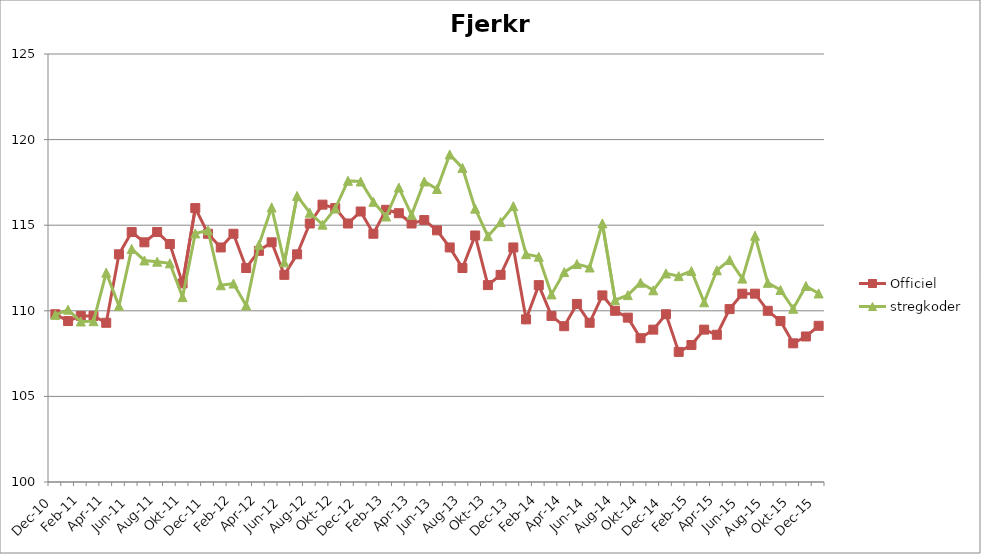
| Category | Officiel | stregkoder |
|---|---|---|
|  Dec-10 | 109.8 | 109.766 |
|  Jan-11 | 109.4 | 110.069 |
|  Feb-11 | 109.7 | 109.375 |
|  Mar-11 | 109.7 | 109.392 |
|  Apr-11 | 109.3 | 112.228 |
|  Maj-11 | 113.3 | 110.278 |
|  Jun-11 | 114.6 | 113.613 |
|  Jul-11 | 114 | 112.941 |
|  Aug-11 | 114.6 | 112.869 |
|  Sep-11 | 113.9 | 112.773 |
|  Okt-11 | 111.6 | 110.8 |
|  Nov-11 | 116 | 114.517 |
|  Dec-11 | 114.5 | 114.702 |
|  Jan-12 | 113.7 | 111.493 |
|  Feb-12 | 114.5 | 111.592 |
|  Mar-12 | 112.5 | 110.309 |
|  Apr-12 | 113.5 | 113.854 |
|  Maj-12 | 114 | 116.037 |
|  Jun-12 | 112.1 | 112.829 |
|  Jul-12 | 113.3 | 116.711 |
|  Aug-12 | 115.1 | 115.728 |
|  Sep-12 | 116.2 | 115.032 |
|  Okt-12 | 116 | 115.973 |
|  Nov-12 | 115.1 | 117.595 |
|  Dec-12 | 115.8 | 117.551 |
|  Jan-13 | 114.5 | 116.366 |
|  Feb-13 | 115.9 | 115.507 |
|  Mar-13 | 115.7 | 117.201 |
|  Apr-13 | 115.1 | 115.603 |
|  Maj-13 | 115.3 | 117.554 |
|  Jun-13 | 114.7 | 117.115 |
|  Jul-13 | 113.7 | 119.133 |
|  Aug-13 | 112.5 | 118.348 |
|  Sep-13 | 114.4 | 115.968 |
|  Okt-13 | 111.5 | 114.358 |
|  Nov-13 | 112.1 | 115.181 |
|  Dec-13 | 113.7 | 116.113 |
|  Jan-14 | 109.5 | 113.308 |
|  Feb-14 | 111.5 | 113.16 |
|  Mar-14 | 109.7 | 110.958 |
|  Apr-14 | 109.1 | 112.259 |
|  Maj-14 | 110.4 | 112.731 |
|  Jun-14 | 109.3 | 112.529 |
|  Jul-14 | 110.9 | 115.104 |
|  Aug-14 | 110 | 110.618 |
|  Sep-14 | 109.6 | 110.916 |
|  Okt-14 | 108.4 | 111.642 |
|  Nov-14 | 108.9 | 111.198 |
|  Dec-14 | 109.8 | 112.185 |
|  Jan-15 | 107.6 | 112.027 |
|  Feb-15 | 108 | 112.322 |
|  Mar-15 | 108.9 | 110.497 |
|  Apr-15 | 108.6 | 112.365 |
|  Maj-15 | 110.1 | 112.966 |
| Jun-15 | 111 | 111.88 |
| Jul-15 | 111 | 114.379 |
| Aug-15 | 110 | 111.632 |
| Sep-15 | 109.4 | 111.217 |
| Okt-15 | 108.1 | 110.119 |
| Nov-15 | 108.5 | 111.451 |
| Dec-15 | 109.124 | 111.014 |